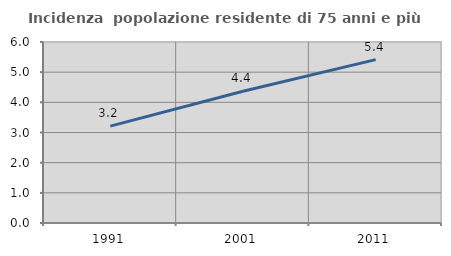
| Category | Incidenza  popolazione residente di 75 anni e più |
|---|---|
| 1991.0 | 3.21 |
| 2001.0 | 4.365 |
| 2011.0 | 5.415 |